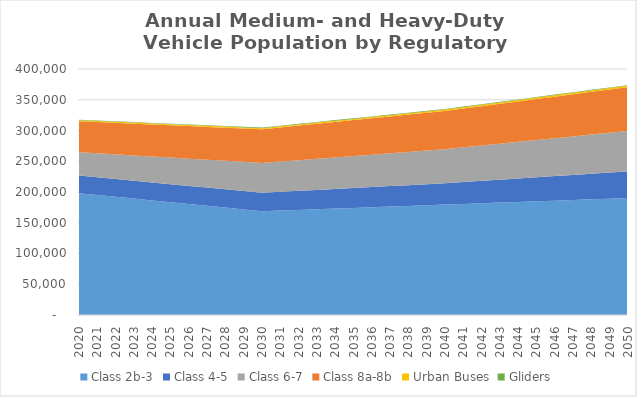
| Category | Class 2b-3 | Class 4-5 | Class 6-7 | Class 8a-8b | Urban Buses | Gliders |
|---|---|---|---|---|---|---|
| 2020.0 | 198100 | 28550 | 38000 | 50340 | 1710 | 740 |
| 2021.0 | 195160 | 28700 | 39050 | 50770 | 1710 | 770 |
| 2022.0 | 192230 | 28850 | 40110 | 51210 | 1720 | 790 |
| 2023.0 | 189290 | 29010 | 41160 | 51640 | 1720 | 820 |
| 2024.0 | 186360 | 29160 | 42220 | 52080 | 1730 | 840 |
| 2025.0 | 183420 | 29310 | 43270 | 52510 | 1730 | 870 |
| 2026.0 | 180480 | 29460 | 44320 | 52940 | 1730 | 900 |
| 2027.0 | 177540 | 29610 | 45370 | 53370 | 1740 | 920 |
| 2028.0 | 174610 | 29770 | 46430 | 53810 | 1740 | 950 |
| 2029.0 | 171670 | 29920 | 47480 | 54240 | 1750 | 970 |
| 2030.0 | 168730 | 30070 | 48530 | 54670 | 1750 | 1000 |
| 2031.0 | 169810 | 30530 | 49220 | 55420 | 1780 | 1000 |
| 2032.0 | 170890 | 31000 | 49910 | 56180 | 1820 | 1010 |
| 2033.0 | 171970 | 31460 | 50600 | 56930 | 1850 | 1010 |
| 2034.0 | 173050 | 31930 | 51290 | 57690 | 1890 | 1020 |
| 2035.0 | 174130 | 32390 | 51980 | 58440 | 1920 | 1020 |
| 2036.0 | 175210 | 32850 | 52670 | 59190 | 1950 | 1030 |
| 2037.0 | 176290 | 33320 | 53360 | 59940 | 1990 | 1030 |
| 2038.0 | 177370 | 33780 | 54050 | 60700 | 2020 | 1040 |
| 2039.0 | 178450 | 34250 | 54740 | 61450 | 2060 | 1040 |
| 2040.0 | 179530 | 34710 | 55430 | 62200 | 2090 | 1050 |
| 2041.0 | 180600 | 35570 | 56460 | 63110 | 2120 | 1040 |
| 2042.0 | 181660 | 36440 | 57490 | 64010 | 2150 | 1030 |
| 2043.0 | 182730 | 37300 | 58530 | 64920 | 2190 | 1020 |
| 2044.0 | 183790 | 38170 | 59560 | 65820 | 2220 | 1010 |
| 2045.0 | 184860 | 39030 | 60590 | 66730 | 2250 | 1000 |
| 2046.0 | 185930 | 39890 | 61620 | 67640 | 2280 | 990 |
| 2047.0 | 186990 | 40760 | 62650 | 68540 | 2320 | 980 |
| 2048.0 | 188060 | 41620 | 63680 | 69450 | 2350 | 980 |
| 2049.0 | 189120 | 42490 | 64710 | 70350 | 2390 | 970 |
| 2050.0 | 190190 | 43350 | 65740 | 71260 | 2420 | 960 |